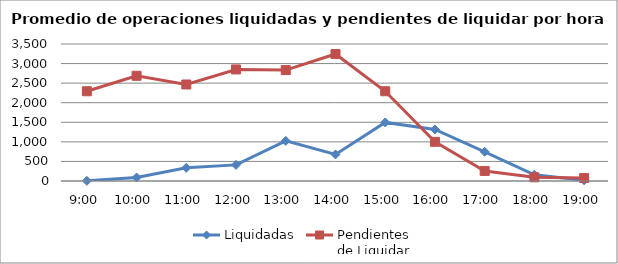
| Category | Liquidadas | Pendientes
de Liquidar |
|---|---|---|
| 0.375 | 4.1 | 2292.55 |
| 0.4166666666666667 | 89.45 | 2687.7 |
| 0.4583333333333333 | 338.25 | 2465.95 |
| 0.5 | 411.9 | 2849.85 |
| 0.5416666666666666 | 1024.25 | 2833.15 |
| 0.583333333333333 | 677.55 | 3245.2 |
| 0.625 | 1496.2 | 2292.65 |
| 0.666666666666667 | 1317.2 | 1000.5 |
| 0.708333333333333 | 746.25 | 256.95 |
| 0.75 | 160 | 94.3 |
| 0.791666666666667 | 17.45 | 74.9 |